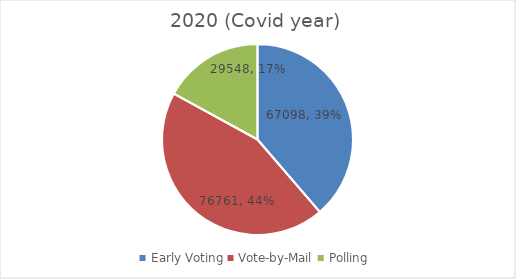
| Category | Series 0 |
|---|---|
| Early Voting | 67098 |
| Vote-by-Mail | 76761 |
| Polling | 29548 |